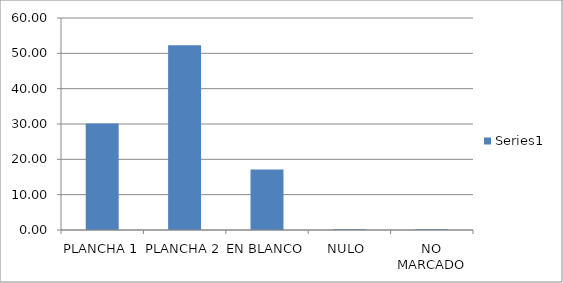
| Category | Series 0 |
|---|---|
| PLANCHA 1 | 30.12 |
| PLANCHA 2 | 52.289 |
| EN BLANCO | 17.108 |
| NULO  | 0.241 |
| NO MARCADO | 0.241 |